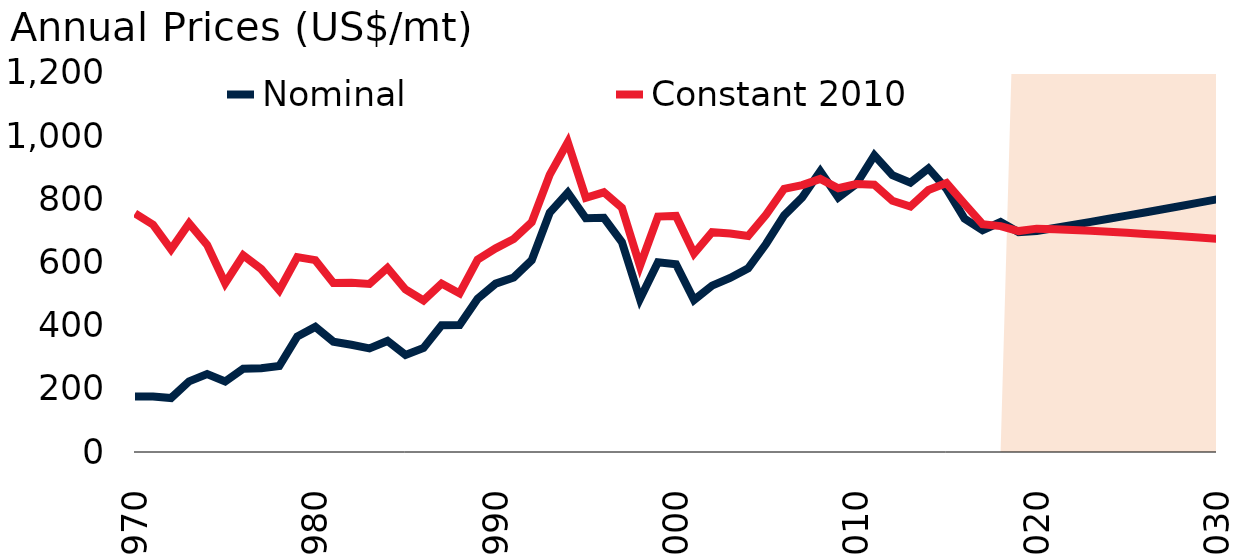
| Category | Nominal | Constant 2010 |
|---|---|---|
| 1970.0 | 175.406 | 755.586 |
| 1971.0 | 175.724 | 719.748 |
| 1972.0 | 170.929 | 641.801 |
| 1973.0 | 223.529 | 723.708 |
| 1974.0 | 246.834 | 655.776 |
| 1975.0 | 223.438 | 534.505 |
| 1976.0 | 263.548 | 622.809 |
| 1977.0 | 264.984 | 579.297 |
| 1978.0 | 272.282 | 512.215 |
| 1979.0 | 365.932 | 617.1 |
| 1980.0 | 396.201 | 607.444 |
| 1981.0 | 349.406 | 535.088 |
| 1982.0 | 339.383 | 535.694 |
| 1983.0 | 328.136 | 532.049 |
| 1984.0 | 351.637 | 582.986 |
| 1985.0 | 307.132 | 514.566 |
| 1986.0 | 329.342 | 479.737 |
| 1987.0 | 401.297 | 533.425 |
| 1988.0 | 402.326 | 502.198 |
| 1989.0 | 485.279 | 609.393 |
| 1990.0 | 533.082 | 644.813 |
| 1991.0 | 552.52 | 674.528 |
| 1992.0 | 607.217 | 727.701 |
| 1993.0 | 758.25 | 878.391 |
| 1994.0 | 821.036 | 980.577 |
| 1995.0 | 739.951 | 804.994 |
| 1996.0 | 741.349 | 822.18 |
| 1997.0 | 664.526 | 773.405 |
| 1998.0 | 484.148 | 589.196 |
| 1999.0 | 600.816 | 745.509 |
| 2000.0 | 594.697 | 747.486 |
| 2001.0 | 481.352 | 628.587 |
| 2002.0 | 526.812 | 696.079 |
| 2003.0 | 550.991 | 692.043 |
| 2004.0 | 581.294 | 683.665 |
| 2005.0 | 659.382 | 751.824 |
| 2006.0 | 749.343 | 833.288 |
| 2007.0 | 806.297 | 844.912 |
| 2008.0 | 889.092 | 864.59 |
| 2009.0 | 805.524 | 835.068 |
| 2010.0 | 848.272 | 848.272 |
| 2011.0 | 939.447 | 846.381 |
| 2012.0 | 876.342 | 795.408 |
| 2013.0 | 852.798 | 777.43 |
| 2014.0 | 897.942 | 829.757 |
| 2015.0 | 833.25 | 851.49 |
| 2016.0 | 738.879 | 785.76 |
| 2017.0 | 702.11 | 721.435 |
| 2018.0 | 727.943 | 715.214 |
| 2019.0 | 695.888 | 699.539 |
| 2020.0 | 700 | 707.146 |
| 2021.0 | 709.41 | 705.383 |
| 2022.0 | 718.946 | 703.084 |
| 2023.0 | 728.611 | 700.384 |
| 2024.0 | 738.405 | 697.365 |
| 2025.0 | 748.331 | 694.082 |
| 2026.0 | 758.391 | 690.573 |
| 2027.0 | 768.586 | 686.869 |
| 2028.0 | 778.918 | 682.989 |
| 2029.0 | 789.388 | 678.951 |
| 2030.0 | 800 | 674.766 |